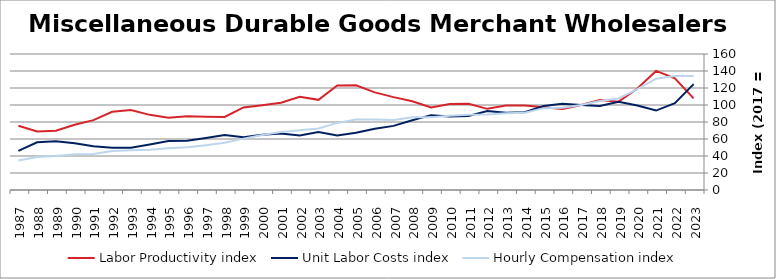
| Category | Labor Productivity index | Unit Labor Costs index | Hourly Compensation index |
|---|---|---|---|
| 2023.0 | 107.758 | 124.58 | 134.245 |
| 2022.0 | 131.415 | 102.138 | 134.224 |
| 2021.0 | 140.096 | 93.449 | 130.918 |
| 2020.0 | 119.308 | 99.498 | 118.709 |
| 2019.0 | 103.9 | 103.688 | 107.732 |
| 2018.0 | 105.901 | 98.766 | 104.595 |
| 2017.0 | 100 | 100 | 100 |
| 2016.0 | 95.336 | 101.415 | 96.685 |
| 2015.0 | 97.486 | 98.779 | 96.296 |
| 2014.0 | 99.306 | 91.465 | 90.83 |
| 2013.0 | 99.539 | 90.777 | 90.358 |
| 2012.0 | 95.479 | 92.929 | 88.728 |
| 2011.0 | 101.551 | 87.153 | 88.505 |
| 2010.0 | 101.189 | 86.376 | 87.404 |
| 2009.0 | 97.219 | 88.05 | 85.601 |
| 2008.0 | 104.362 | 82.049 | 85.628 |
| 2007.0 | 109.283 | 75.442 | 82.445 |
| 2006.0 | 114.832 | 72.134 | 82.833 |
| 2005.0 | 123.115 | 67.256 | 82.803 |
| 2004.0 | 123.01 | 64.171 | 78.937 |
| 2003.0 | 106.078 | 68.256 | 72.405 |
| 2002.0 | 109.585 | 64.27 | 70.43 |
| 2001.0 | 102.574 | 66.474 | 68.185 |
| 2000.0 | 99.715 | 64.913 | 64.728 |
| 1999.0 | 97.197 | 62.19 | 60.447 |
| 1998.0 | 85.905 | 64.679 | 55.563 |
| 1997.0 | 86.2 | 61.231 | 52.782 |
| 1996.0 | 86.801 | 57.87 | 50.232 |
| 1995.0 | 85.055 | 57.768 | 49.134 |
| 1994.0 | 88.412 | 53.586 | 47.376 |
| 1993.0 | 94.057 | 49.71 | 46.756 |
| 1992.0 | 92.071 | 49.852 | 45.899 |
| 1991.0 | 82.155 | 51.567 | 42.365 |
| 1990.0 | 76.7 | 54.97 | 42.162 |
| 1989.0 | 69.622 | 57.446 | 39.995 |
| 1988.0 | 68.961 | 56.097 | 38.685 |
| 1987.0 | 75.655 | 45.993 | 34.796 |